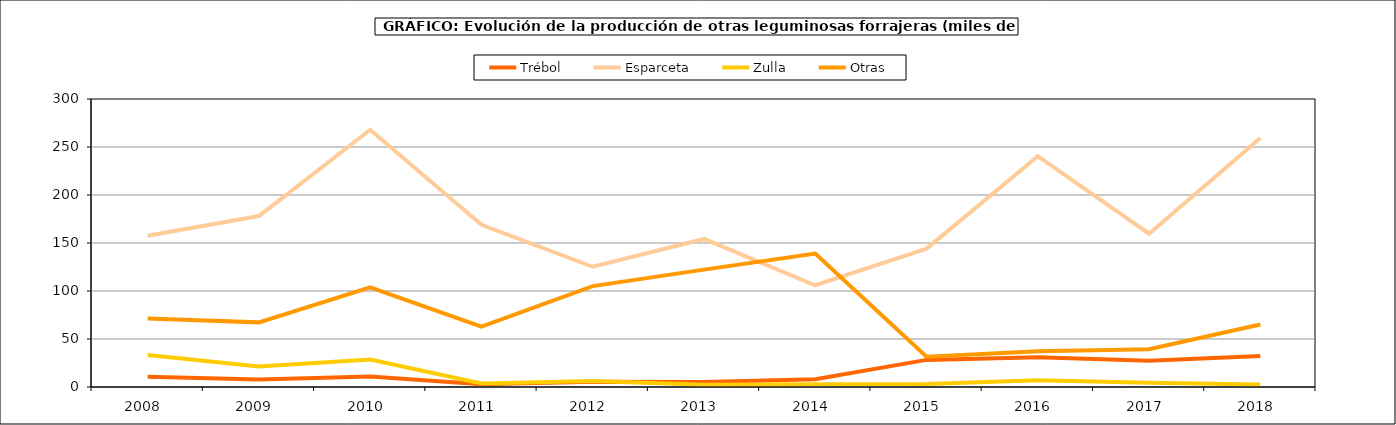
| Category | Trébol | Esparceta | Zulla | Otras |
|---|---|---|---|---|
| 2008.0 | 10.657 | 157.588 | 33.339 | 71.318 |
| 2009.0 | 7.859 | 178.059 | 21.305 | 67.327 |
| 2010.0 | 10.903 | 268.016 | 28.537 | 103.706 |
| 2011.0 | 2.955 | 168.906 | 3.64 | 62.873 |
| 2012.0 | 5.531 | 125.242 | 6.24 | 105.056 |
| 2013.0 | 5.243 | 154.216 | 2.307 | 122.265 |
| 2014.0 | 8 | 105.99 | 2.813 | 139.025 |
| 2015.0 | 28.241 | 144.128 | 3.1 | 31.635 |
| 2016.0 | 30.989 | 240.408 | 6.945 | 37.171 |
| 2017.0 | 27.256 | 159.694 | 4.469 | 39.33 |
| 2018.0 | 32.363 | 259.362 | 2.725 | 65.063 |